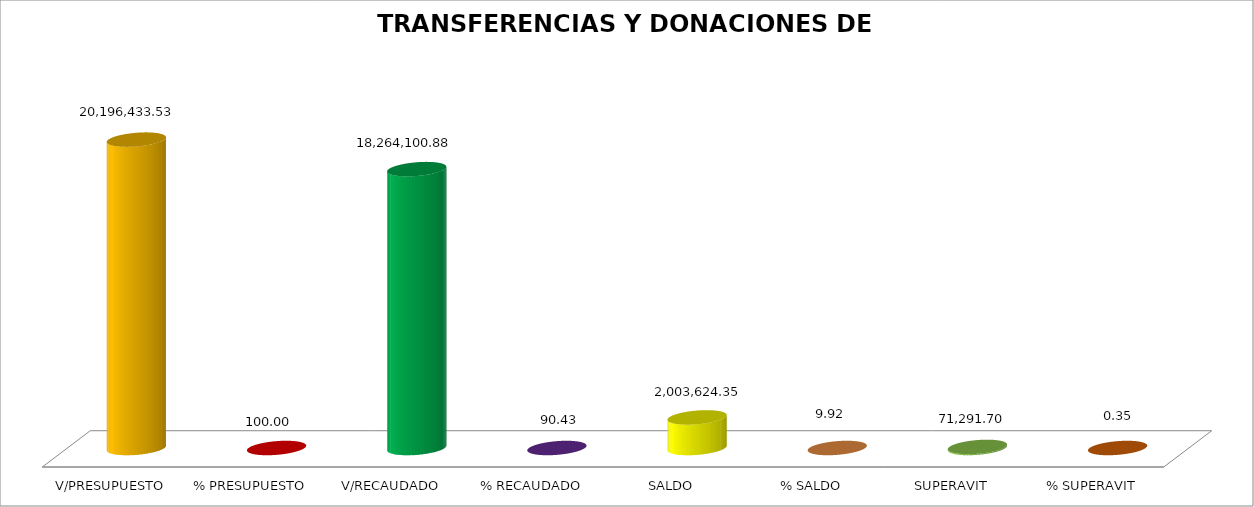
| Category | TRANSFERENCIAS Y DONACIONES DE CAPITAL |
|---|---|
| V/PRESUPUESTO | 20196433.53 |
| % PRESUPUESTO | 100 |
| V/RECAUDADO | 18264100.88 |
| % RECAUDADO | 90.432 |
| SALDO | 2003624.35 |
| % SALDO | 9.921 |
| SUPERAVIT | 71291.7 |
| % SUPERAVIT | 0.353 |